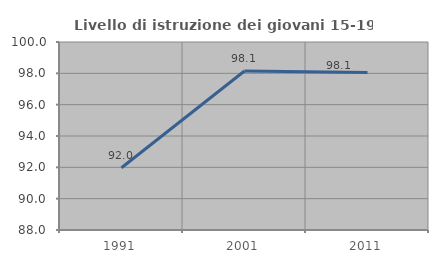
| Category | Livello di istruzione dei giovani 15-19 anni |
|---|---|
| 1991.0 | 91.971 |
| 2001.0 | 98.148 |
| 2011.0 | 98.058 |